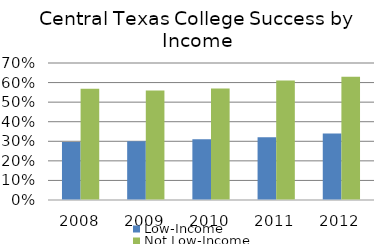
| Category | Low-Income | Not Low-Income |
|---|---|---|
| 2008.0 | 0.296 | 0.568 |
| 2009.0 | 0.3 | 0.56 |
| 2010.0 | 0.31 | 0.57 |
| 2011.0 | 0.32 | 0.61 |
| 2012.0 | 0.34 | 0.63 |